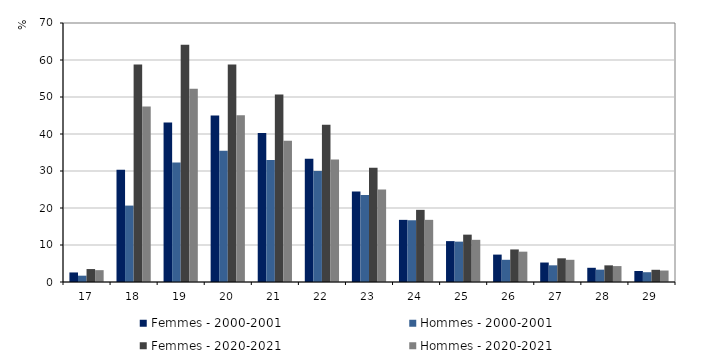
| Category | Femmes - 2000-2001 | Hommes - 2000-2001 | Femmes - 2020-2021 | Hommes - 2020-2021 |
|---|---|---|---|---|
| 17.0 | 2.58 | 1.709 | 3.5 | 3.2 |
| 18.0 | 30.314 | 20.653 | 58.8 | 47.4 |
| 19.0 | 43.129 | 32.289 | 64.1 | 52.2 |
| 20.0 | 44.97 | 35.48 | 58.8 | 45.1 |
| 21.0 | 40.271 | 32.995 | 50.7 | 38.2 |
| 22.0 | 33.339 | 30.01 | 42.5 | 33.1 |
| 23.0 | 24.462 | 23.514 | 30.9 | 25 |
| 24.0 | 16.793 | 16.689 | 19.5 | 16.8 |
| 25.0 | 11.05 | 10.911 | 12.8 | 11.4 |
| 26.0 | 7.406 | 6.003 | 8.8 | 8.2 |
| 27.0 | 5.263 | 4.509 | 6.4 | 6 |
| 28.0 | 3.84 | 3.336 | 4.5 | 4.3 |
| 29.0 | 2.966 | 2.645 | 3.3 | 3.1 |